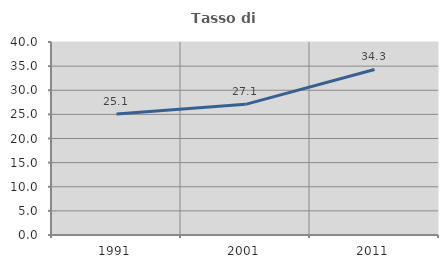
| Category | Tasso di occupazione   |
|---|---|
| 1991.0 | 25.099 |
| 2001.0 | 27.081 |
| 2011.0 | 34.31 |